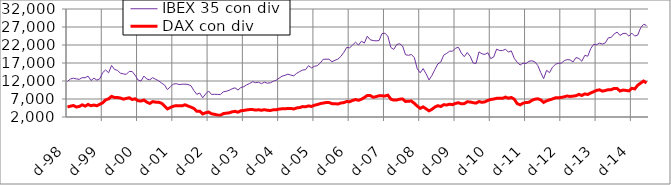
| Category | IBEX 35 con div | DAX con div |
|---|---|---|
| 1998-12-01 | 11888.3 | 4781.73 |
| 1999-01-01 | 12556.3 | 5002.39 |
| 1999-02-01 | 12783.5 | 5190.82 |
| 1999-03-01 | 12583.2 | 4784.31 |
| 1999-04-01 | 12459.2 | 4914.59 |
| 1999-05-01 | 12932.3 | 5377.56 |
| 1999-06-01 | 12890.5 | 5021.24 |
| 1999-07-01 | 13362.3 | 5480.22 |
| 1999-08-01 | 12134.4 | 5129.5 |
| 1999-09-01 | 12784.4 | 5317.12 |
| 1999-10-01 | 12248.1 | 5124.55 |
| 1999-11-01 | 12596.6 | 5524.92 |
| 1999-12-01 | 14347.9 | 5933.84 |
| 2000-01-01 | 15063.4 | 6750.76 |
| 2000-02-01 | 14276.6 | 7050.46 |
| 2000-03-01 | 16319 | 7727.93 |
| 2000-04-01 | 15217.5 | 7429.22 |
| 2000-05-01 | 14941.7 | 7414.68 |
| 2000-06-01 | 14182.9 | 7272.76 |
| 2000-07-01 | 13971.4 | 6958.96 |
| 2000-08-01 | 13841.7 | 7145.53 |
| 2000-09-01 | 14656.7 | 7344.67 |
| 2000-10-01 | 14636.9 | 6862.26 |
| 2000-11-01 | 13627.8 | 7059.07 |
| 2000-12-01 | 12282.4 | 6512.91 |
| 2001-01-01 | 11981 | 6433.61 |
| 2001-02-01 | 13375.8 | 6704.68 |
| 2001-03-01 | 12534.2 | 6123.38 |
| 2001-04-01 | 12321.1 | 5760.76 |
| 2001-05-01 | 12930.4 | 6264.51 |
| 2001-06-01 | 12462.4 | 6125.17 |
| 2001-07-01 | 12072.2 | 6109.5 |
| 2001-08-01 | 11431.8 | 5835.23 |
| 2001-09-01 | 10891.7 | 5094.1 |
| 2001-10-01 | 9612.1 | 4239.97 |
| 2001-11-01 | 10392.7 | 4636.13 |
| 2001-12-01 | 11128.5 | 4988.44 |
| 2002-01-01 | 11255.4 | 5160.1 |
| 2002-02-01 | 11018.6 | 5097.06 |
| 2002-03-01 | 11099.7 | 5097.41 |
| 2002-04-01 | 11128.6 | 5397.29 |
| 2002-05-01 | 11033.4 | 5041.2 |
| 2002-06-01 | 10690.5 | 4747.95 |
| 2002-07-01 | 9372.5 | 4366.81 |
| 2002-08-01 | 8290.1 | 3606.45 |
| 2002-09-01 | 8653.7 | 3609.41 |
| 2002-10-01 | 7329.2 | 2865.23 |
| 2002-11-01 | 8398.1 | 3165.16 |
| 2002-12-01 | 9230.7 | 3380.2 |
| 2003-01-01 | 8272.4 | 2892.63 |
| 2003-02-01 | 8310.1 | 2751.99 |
| 2003-03-01 | 8268.7 | 2549.65 |
| 2003-04-01 | 8228.5 | 2450.19 |
| 2003-05-01 | 8985.6 | 2942.04 |
| 2003-06-01 | 9149.5 | 3064.56 |
| 2003-07-01 | 9399.4 | 3146.55 |
| 2003-08-01 | 9826 | 3438.89 |
| 2003-09-01 | 10105.5 | 3571.22 |
| 2003-10-01 | 9486.3 | 3329.83 |
| 2003-11-01 | 10191.3 | 3744.5 |
| 2003-12-01 | 10419.3 | 3821.2 |
| 2004-01-01 | 10935 | 3965.16 |
| 2004-02-01 | 11325.9 | 4071.6 |
| 2004-03-01 | 11812.2 | 4054.43 |
| 2004-04-01 | 11532.5 | 3924.85 |
| 2004-05-01 | 11669.2 | 4007.65 |
| 2004-06-01 | 11259.9 | 3864.18 |
| 2004-07-01 | 11670.3 | 4035.02 |
| 2004-08-01 | 11396.3 | 3862.71 |
| 2004-09-01 | 11497.5 | 3817.62 |
| 2004-10-01 | 11905.5 | 3994.96 |
| 2004-11-01 | 12215 | 4012.64 |
| 2004-12-01 | 12793.7 | 4186.03 |
| 2005-01-01 | 13329.7 | 4291.53 |
| 2005-02-01 | 13586.7 | 4279.97 |
| 2005-03-01 | 13902.7 | 4383.62 |
| 2005-04-01 | 13640.2 | 4373.53 |
| 2005-05-01 | 13451.9 | 4224.02 |
| 2005-06-01 | 14145.1 | 4527.17 |
| 2005-07-01 | 14622 | 4617.07 |
| 2005-08-01 | 15045.8 | 4890.85 |
| 2005-09-01 | 15143.2 | 4842.94 |
| 2005-10-01 | 16261.8 | 5082.07 |
| 2005-11-01 | 15632.3 | 4922.55 |
| 2005-12-01 | 16069 | 5266.55 |
| 2006-01-01 | 16262.9 | 5449.98 |
| 2006-02-01 | 16993.8 | 5726.53 |
| 2006-03-01 | 18025.3 | 5866.61 |
| 2006-04-01 | 18058.8 | 6024.05 |
| 2006-05-01 | 18054.2 | 6009.89 |
| 2006-06-01 | 17347.2 | 5707.59 |
| 2006-07-01 | 17768.2 | 5712.69 |
| 2006-08-01 | 18071.1 | 5596.74 |
| 2006-09-01 | 18822 | 5876.54 |
| 2006-10-01 | 19937.9 | 5999.46 |
| 2006-11-01 | 21323.1 | 6291.9 |
| 2006-12-01 | 21219.4 | 6241.13 |
| 2007-01-01 | 21974 | 6596.92 |
| 2007-02-01 | 22782.4 | 6851.28 |
| 2007-03-01 | 21990.4 | 6640.24 |
| 2007-04-01 | 23043.1 | 6937.17 |
| 2007-05-01 | 22533.2 | 7408.87 |
| 2007-06-01 | 24444.8 | 7987.85 |
| 2007-07-01 | 23446.2 | 7958.24 |
| 2007-08-01 | 23228.9 | 7473.93 |
| 2007-09-01 | 23151.3 | 7648.58 |
| 2007-10-01 | 23240.5 | 7922.42 |
| 2007-11-01 | 25170.9 | 7880.85 |
| 2007-12-01 | 25253.1 | 7837.26 |
| 2008-01-01 | 24446 | 8067.32 |
| 2008-02-01 | 21318 | 6968.67 |
| 2008-03-01 | 20764.1 | 6689.95 |
| 2008-04-01 | 22114.6 | 6720.33 |
| 2008-05-01 | 22351.8 | 6948.82 |
| 2008-06-01 | 21728.2 | 7008.77 |
| 2008-07-01 | 19312.3 | 6315.94 |
| 2008-08-01 | 19142.6 | 6396.46 |
| 2008-09-01 | 19353.1 | 6421.8 |
| 2008-10-01 | 18506.9 | 5806.33 |
| 2008-11-01 | 15370.3 | 5026.84 |
| 2008-12-01 | 14285.6 | 4394.79 |
| 2009-01-01 | 15447.7 | 4810.2 |
| 2009-02-01 | 14015.7 | 4271.04 |
| 2009-03-01 | 12289.7 | 3710.07 |
| 2009-04-01 | 13556.3 | 4131.07 |
| 2009-05-01 | 15191.9 | 4769.45 |
| 2009-06-01 | 16732 | 5142.56 |
| 2009-07-01 | 17274.3 | 4905.44 |
| 2009-08-01 | 19184.6 | 5426.85 |
| 2009-09-01 | 19668.3 | 5327.29 |
| 2009-10-01 | 20277.8 | 5554.55 |
| 2009-11-01 | 20280.5 | 5430.82 |
| 2009-12-01 | 21112.4 | 5776.61 |
| 2010-01-01 | 21360.1 | 5957.43 |
| 2010-02-01 | 19754.8 | 5654.48 |
| 2010-03-01 | 18750 | 5713.51 |
| 2010-04-01 | 19889.5 | 6235.56 |
| 2010-05-01 | 18875.3 | 6166.92 |
| 2010-06-01 | 17005.8 | 5981.27 |
| 2010-07-01 | 16881.5 | 5857.43 |
| 2010-08-01 | 20088.3 | 6292.13 |
| 2010-09-01 | 19556 | 6083.9 |
| 2010-10-01 | 19383 | 6211.34 |
| 2010-11-01 | 19839.8 | 6604.86 |
| 2010-12-01 | 18202.5 | 6866.63 |
| 2011-01-01 | 18662.1 | 6989.74 |
| 2011-02-01 | 20845.8 | 7184.27 |
| 2011-03-01 | 20472.1 | 7223.3 |
| 2011-04-01 | 20444.7 | 7179.81 |
| 2011-05-01 | 20851.1 | 7527.64 |
| 2011-06-01 | 20031 | 7217.43 |
| 2011-07-01 | 20363.6 | 7419.44 |
| 2011-08-01 | 18297.8 | 6953.98 |
| 2011-09-01 | 17205.8 | 5730.63 |
| 2011-10-01 | 16444.8 | 5376.7 |
| 2011-11-01 | 16956.5 | 5834.51 |
| 2011-12-01 | 16849.1 | 6035.88 |
| 2012-01-01 | 17478.3 | 6075.52 |
| 2012-02-01 | 17619.1 | 6616.64 |
| 2012-03-01 | 17331.2 | 6941.77 |
| 2012-04-01 | 16315.9 | 7056.65 |
| 2012-05-01 | 14367.1 | 6761.19 |
| 2012-06-01 | 12665.9 | 6050.29 |
| 2012-07-01 | 14950.7 | 6496.08 |
| 2012-08-01 | 14316.4 | 6754.46 |
| 2012-09-01 | 15840 | 7014.83 |
| 2012-10-01 | 16622 | 7326.73 |
| 2012-11-01 | 16921.2 | 7335.67 |
| 2012-12-01 | 16955.8 | 7435.21 |
| 2013-01-01 | 17634.8 | 7612.39 |
| 2013-02-01 | 17947.5 | 7833.39 |
| 2013-03-01 | 17854.5 | 7708.16 |
| 2013-04-01 | 17280.5 | 7795.31 |
| 2013-05-01 | 18512.6 | 7913.71 |
| 2013-06-01 | 18253.5 | 8285.8 |
| 2013-07-01 | 17494.7 | 7983.92 |
| 2013-08-01 | 19129.1 | 8410.73 |
| 2013-09-01 | 18881.2 | 8243.87 |
| 2013-10-01 | 20962.3 | 8689.14 |
| 2013-11-01 | 22170.1 | 9007.83 |
| 2013-12-01 | 22080.3 | 9401.96 |
| 2014-01-01 | 22528.6 | 9552.16 |
| 2014-02-01 | 22250.1 | 9186.52 |
| 2014-03-01 | 22600.9 | 9358.89 |
| 2014-04-01 | 24002 | 9603.71 |
| 2014-05-01 | 24100.3 | 9603.23 |
| 2014-06-01 | 25081.7 | 9950.12 |
| 2014-07-01 | 25583.3 | 9902.41 |
| 2014-08-01 | 24644.9 | 9210.08 |
| 2014-09-01 | 25191 | 9479.03 |
| 2014-10-01 | 25242.2 | 9382.03 |
| 2014-11-01 | 24466.3 | 9251.7 |
| 2014-12-01 | 25287.4 | 9963.51 |
| 2015-01-01 | 24469.9 | 9805.55 |
| 2015-02-01 | 24736.2 | 10828.01 |
| 2015-03-01 | 26772.9 | 11410.36 |
| 2015-04-01 | 27761.6 | 12001.38 |
| 2015-05-01 | 27437.8 | 11454.38 |